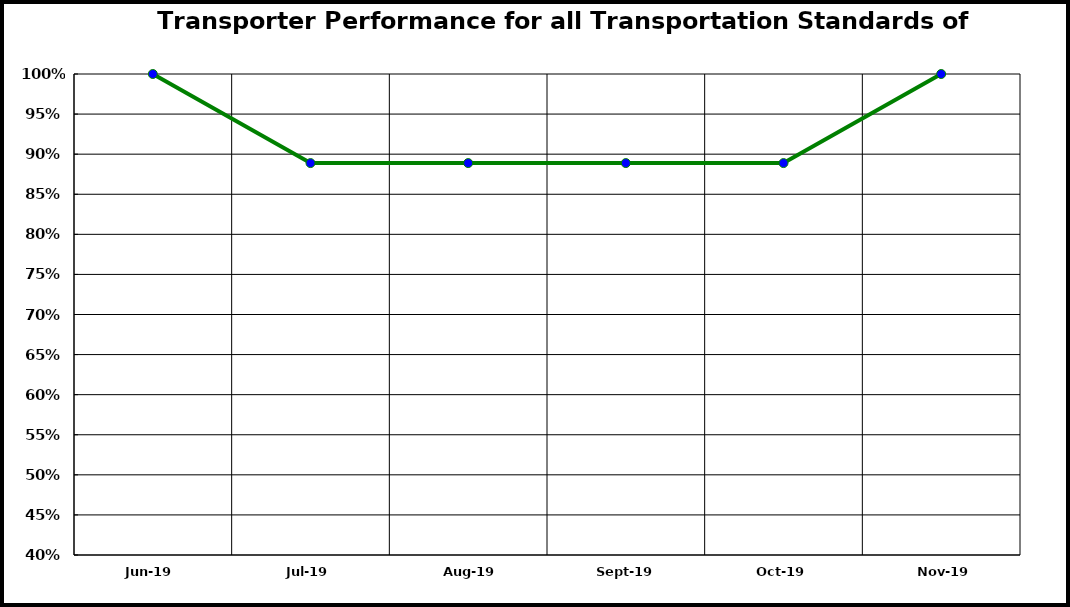
| Category | Performance |
|---|---|
| 2019-06-01 | 1 |
| 2019-07-01 | 0.889 |
| 2019-08-01 | 0.889 |
| 2019-09-01 | 0.889 |
| 2019-10-01 | 0.889 |
| 2019-11-01 | 1 |